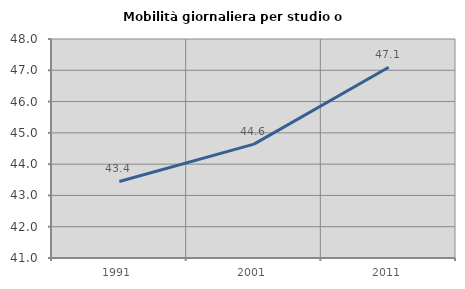
| Category | Mobilità giornaliera per studio o lavoro |
|---|---|
| 1991.0 | 43.446 |
| 2001.0 | 44.639 |
| 2011.0 | 47.099 |